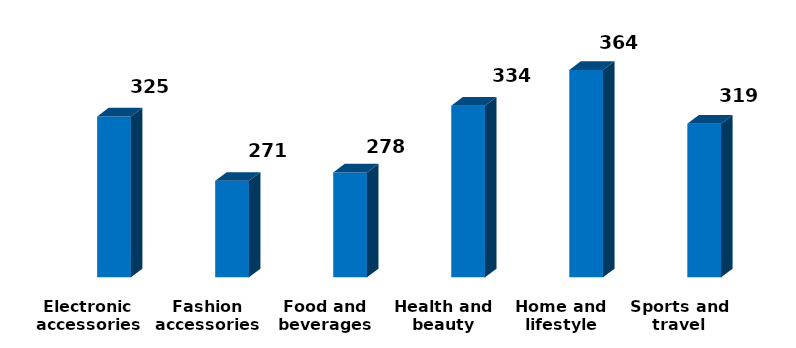
| Category | Series 0 | Series 1 |
|---|---|---|
| Electronic accessories |  | 325 |
| Fashion accessories |  | 271 |
| Food and beverages |  | 278 |
| Health and beauty |  | 334 |
| Home and lifestyle |  | 364 |
| Sports and travel |  | 319 |